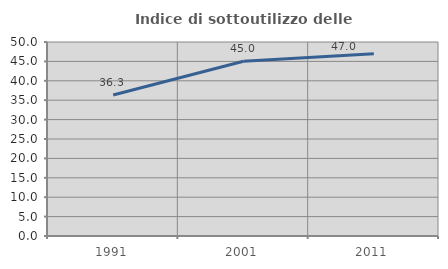
| Category | Indice di sottoutilizzo delle abitazioni  |
|---|---|
| 1991.0 | 36.327 |
| 2001.0 | 45.031 |
| 2011.0 | 46.981 |